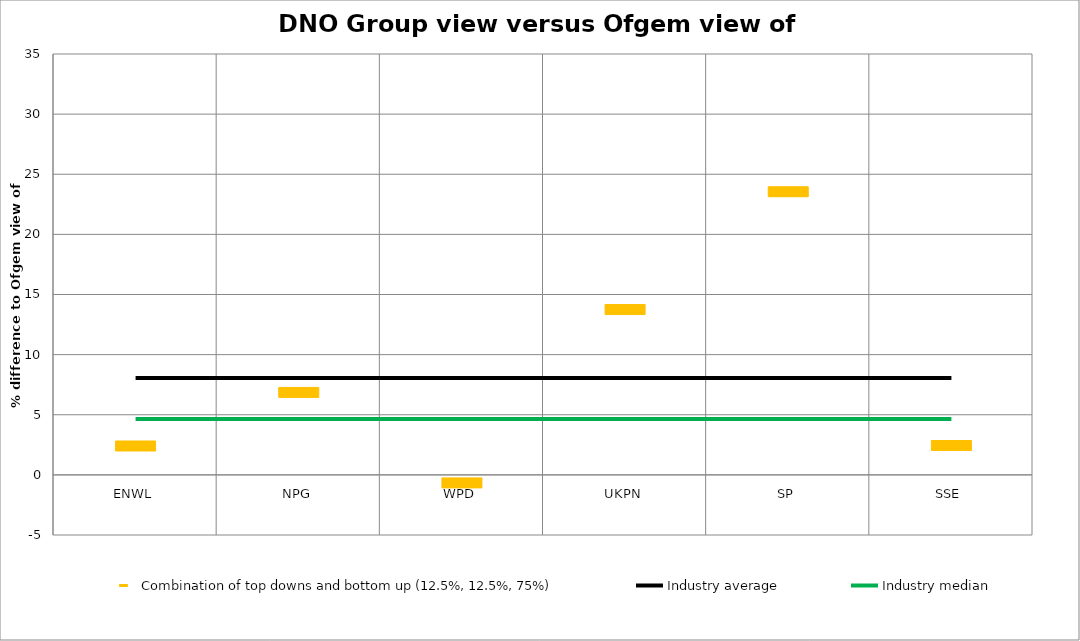
| Category | Combination of top downs and bottom up (12.5%, 12.5%, 75%) | Industry average | Industry median |
|---|---|---|---|
| ENWL | 2.402 | 8.054 | 4.649 |
| NPG | 6.856 | 8.054 | 4.649 |
| WPD | -0.669 | 8.054 | 4.649 |
| UKPN | 13.748 | 8.054 | 4.649 |
| SP | 23.546 | 8.054 | 4.649 |
| SSE | 2.442 | 8.054 | 4.649 |